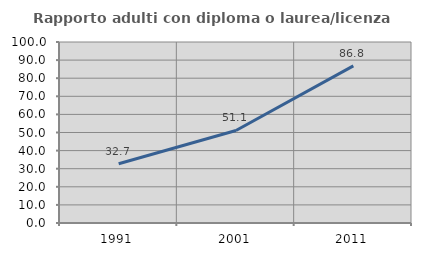
| Category | Rapporto adulti con diploma o laurea/licenza media  |
|---|---|
| 1991.0 | 32.704 |
| 2001.0 | 51.119 |
| 2011.0 | 86.815 |